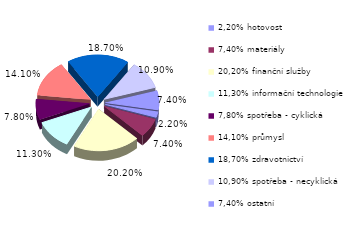
| Category | Series 0 |
|---|---|
| 2,20% hotovost | 0.022 |
| 7,40% materiály | 0.074 |
| 20,20% finanční služby | 0.202 |
| 11,30% informační technologie | 0.113 |
| 7,80% spotřeba - cyklická | 0.078 |
| 14,10% průmysl | 0.141 |
| 18,70% zdravotnictví | 0.187 |
| 10,90% spotřeba - necyklická | 0.109 |
| 7,40% ostatní | 0.074 |